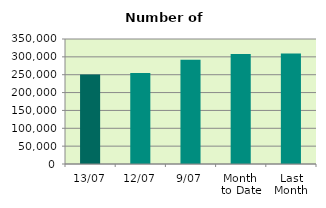
| Category | Series 0 |
|---|---|
| 13/07 | 250406 |
| 12/07 | 254754 |
| 9/07 | 292110 |
| Month 
to Date | 308332.222 |
| Last
Month | 309731.364 |